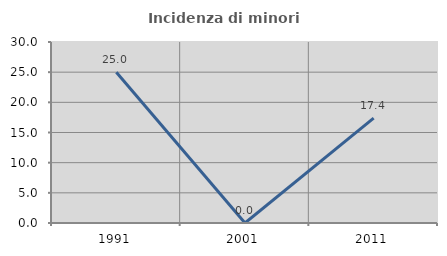
| Category | Incidenza di minori stranieri |
|---|---|
| 1991.0 | 25 |
| 2001.0 | 0 |
| 2011.0 | 17.391 |